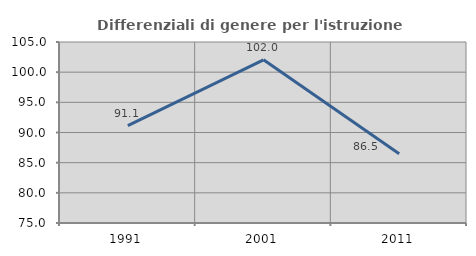
| Category | Differenziali di genere per l'istruzione superiore |
|---|---|
| 1991.0 | 91.137 |
| 2001.0 | 102.047 |
| 2011.0 | 86.473 |